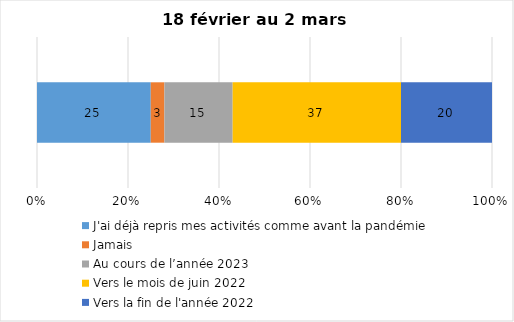
| Category | J'ai déjà repris mes activités comme avant la pandémie | Jamais | Au cours de l’année 2023 | Vers le mois de juin 2022 | Vers la fin de l'année 2022 |
|---|---|---|---|---|---|
| 0 | 25 | 3 | 15 | 37 | 20 |